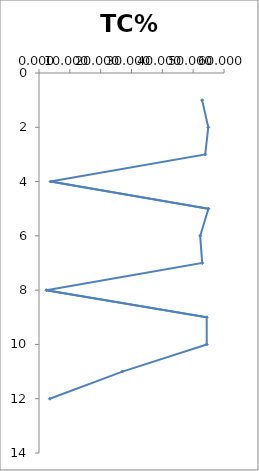
| Category | TC% |
|---|---|
| 52.902 | 1 |
| 54.901 | 2 |
| 53.908 | 3 |
| 3.733 | 4 |
| 54.947 | 5 |
| 52.274 | 6 |
| 52.929 | 7 |
| 2.354 | 8 |
| 54.385 | 9 |
| 54.406 | 10 |
| 27.041 | 11 |
| 3.498 | 12 |